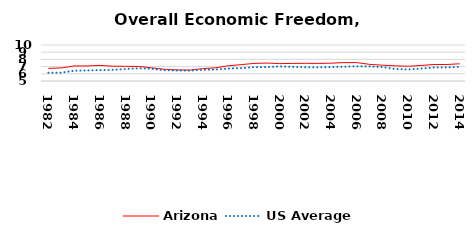
| Category | Arizona | US Average |
|---|---|---|
| 1982.0 | 6.752 | 6.149 |
| 1983.0 | 6.81 | 6.152 |
| 1984.0 | 7.09 | 6.429 |
| 1985.0 | 7.091 | 6.464 |
| 1986.0 | 7.167 | 6.512 |
| 1987.0 | 7.062 | 6.552 |
| 1988.0 | 7.036 | 6.659 |
| 1989.0 | 7.028 | 6.767 |
| 1990.0 | 6.838 | 6.71 |
| 1991.0 | 6.633 | 6.502 |
| 1992.0 | 6.544 | 6.463 |
| 1993.0 | 6.509 | 6.446 |
| 1994.0 | 6.715 | 6.563 |
| 1995.0 | 6.829 | 6.593 |
| 1996.0 | 7.112 | 6.73 |
| 1997.0 | 7.272 | 6.781 |
| 1998.0 | 7.443 | 6.926 |
| 1999.0 | 7.493 | 6.925 |
| 2000.0 | 7.414 | 7.031 |
| 2001.0 | 7.44 | 6.969 |
| 2002.0 | 7.457 | 6.912 |
| 2003.0 | 7.439 | 6.892 |
| 2004.0 | 7.477 | 6.934 |
| 2005.0 | 7.553 | 6.99 |
| 2006.0 | 7.561 | 7.048 |
| 2007.0 | 7.311 | 7.028 |
| 2008.0 | 7.196 | 6.935 |
| 2009.0 | 7.109 | 6.668 |
| 2010.0 | 7.048 | 6.605 |
| 2011.0 | 7.157 | 6.72 |
| 2012.0 | 7.295 | 6.883 |
| 2013.0 | 7.292 | 6.881 |
| 2014.0 | 7.391 | 6.973 |